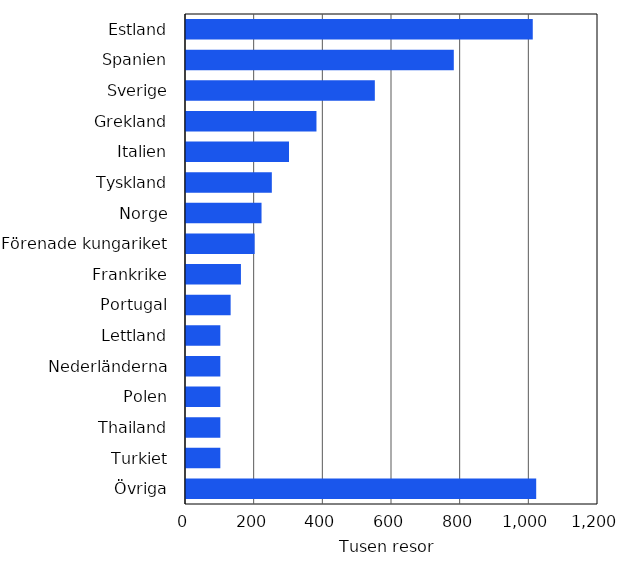
| Category | Tusen resor |
|---|---|
| Estland | 1010 |
| Spanien | 780 |
| Sverige | 550 |
| Grekland | 380 |
| Italien | 300 |
| Tyskland | 250 |
| Norge | 220 |
| Förenade kungariket | 200 |
| Frankrike | 160 |
| Portugal | 130 |
| Lettland | 100 |
| Nederländerna | 100 |
| Polen | 100 |
| Thailand | 100 |
| Turkiet | 100 |
| Övriga | 1020 |